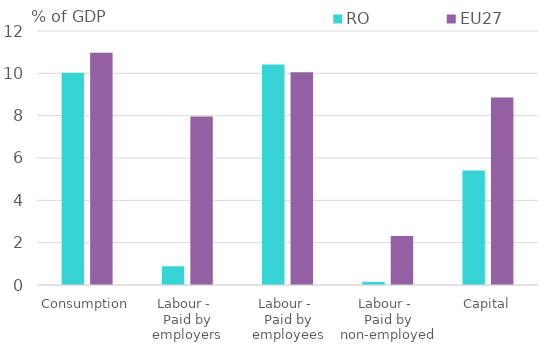
| Category | RO | EU27 |
|---|---|---|
| Consumption | 10.032 | 10.967 |
| Labour - 
Paid by employers | 0.885 | 7.966 |
| Labour - 
Paid by employees | 10.413 | 10.052 |
| Labour - 
Paid by non-employed | 0.151 | 2.311 |
| Capital | 5.404 | 8.858 |